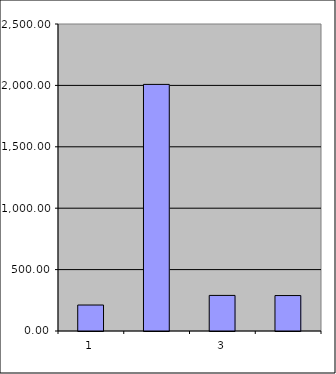
| Category | Series 0 |
|---|---|
| 0 | 211.5 |
| 1 | 2008.19 |
| 2 | 289.746 |
| 3 | 288.673 |